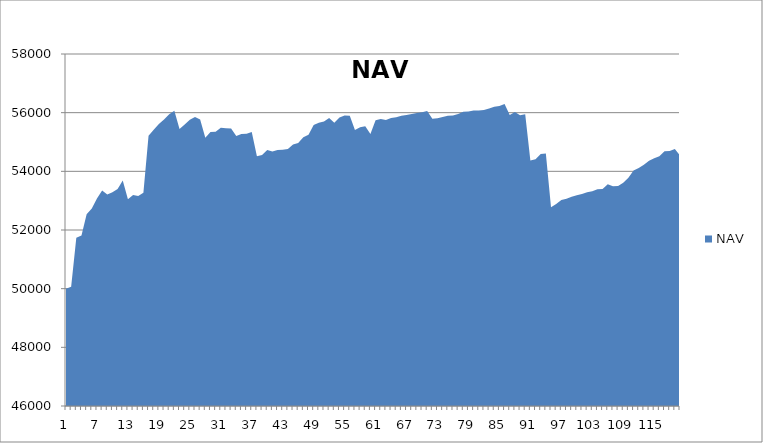
| Category | NAV |
|---|---|
| 0 | 50000 |
| 1 | 50069.444 |
| 2 | 51736.444 |
| 3 | 51809.343 |
| 4 | 52539.343 |
| 5 | 52733.57 |
| 6 | 53070.527 |
| 7 | 53346.212 |
| 8 | 53210.13 |
| 9 | 53285.788 |
| 10 | 53396.685 |
| 11 | 53684.185 |
| 12 | 53050.597 |
| 13 | 53191.058 |
| 14 | 53162.649 |
| 15 | 53270.317 |
| 16 | 55214.762 |
| 17 | 55418.583 |
| 18 | 55617.273 |
| 19 | 55770.477 |
| 20 | 55945.477 |
| 21 | 56069.601 |
| 22 | 55444.601 |
| 23 | 55597.925 |
| 24 | 55757.558 |
| 25 | 55851.308 |
| 26 | 55764.06 |
| 27 | 55148.361 |
| 28 | 55340.028 |
| 29 | 55349.317 |
| 30 | 55485.393 |
| 31 | 55468.704 |
| 32 | 55461.038 |
| 33 | 55205.356 |
| 34 | 55270.356 |
| 35 | 55282.57 |
| 36 | 55341.011 |
| 37 | 54517.482 |
| 38 | 54554.291 |
| 39 | 54731.016 |
| 40 | 54679.093 |
| 41 | 54730.595 |
| 42 | 54736.73 |
| 43 | 54765.085 |
| 44 | 54915.643 |
| 45 | 54969.86 |
| 46 | 55164.665 |
| 47 | 55247.746 |
| 48 | 55575.668 |
| 49 | 55657.905 |
| 50 | 55701.032 |
| 51 | 55819.28 |
| 52 | 55652.834 |
| 53 | 55838.604 |
| 54 | 55905.769 |
| 55 | 55898.888 |
| 56 | 55410.9 |
| 57 | 55504.564 |
| 58 | 55537.603 |
| 59 | 55268.471 |
| 60 | 55737.858 |
| 61 | 55785.708 |
| 62 | 55749.829 |
| 63 | 55815.591 |
| 64 | 55842.34 |
| 65 | 55894.021 |
| 66 | 55916.828 |
| 67 | 55955.697 |
| 68 | 55991.896 |
| 69 | 56012.065 |
| 70 | 56060.293 |
| 71 | 55791.443 |
| 72 | 55810.674 |
| 73 | 55852.843 |
| 74 | 55892.018 |
| 75 | 55900.069 |
| 76 | 55955.739 |
| 77 | 56030.918 |
| 78 | 56036.168 |
| 79 | 56069.975 |
| 80 | 56071.656 |
| 81 | 56090.406 |
| 82 | 56141.798 |
| 83 | 56199.159 |
| 84 | 56228.237 |
| 85 | 56292.573 |
| 86 | 55924.369 |
| 87 | 56019.106 |
| 88 | 55916.165 |
| 89 | 55950.09 |
| 90 | 54367.13 |
| 91 | 54411.811 |
| 92 | 54588.933 |
| 93 | 54611.197 |
| 94 | 52777.117 |
| 95 | 52883.107 |
| 96 | 53025.651 |
| 97 | 53064.908 |
| 98 | 53135.652 |
| 99 | 53186.005 |
| 100 | 53229.789 |
| 101 | 53290.192 |
| 102 | 53319.038 |
| 103 | 53392.112 |
| 104 | 53401.462 |
| 105 | 53559.878 |
| 106 | 53489.526 |
| 107 | 53501.684 |
| 108 | 53607.597 |
| 109 | 53785.178 |
| 110 | 54030.211 |
| 111 | 54113.452 |
| 112 | 54226.272 |
| 113 | 54358.625 |
| 114 | 54444.736 |
| 115 | 54518.421 |
| 116 | 54681.882 |
| 117 | 54693.454 |
| 118 | 54759.719 |
| 119 | 54542.637 |